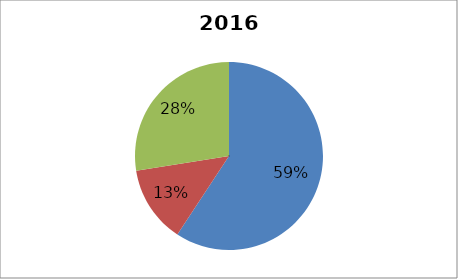
| Category | 2013 Breakdown |
|---|---|
| 0 | 0.593 |
| 1 | 0.132 |
| 2 | 0.275 |